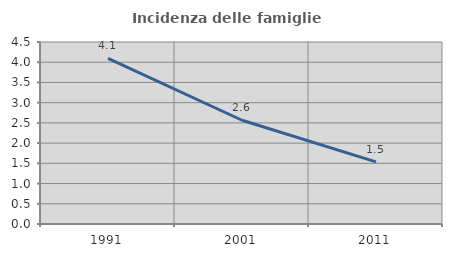
| Category | Incidenza delle famiglie numerose |
|---|---|
| 1991.0 | 4.095 |
| 2001.0 | 2.566 |
| 2011.0 | 1.535 |